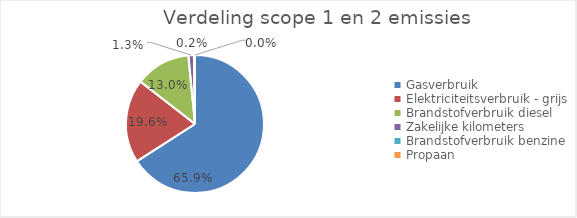
| Category | categorie |
|---|---|
| Gasverbruik | 1062.278 |
| Elektriciteitsverbruik - grijs | 315.586 |
| Brandstofverbruik diesel | 208.721 |
| Zakelijke kilometers | 20.88 |
| Brandstofverbruik benzine | 3.621 |
| Propaan | 0.38 |